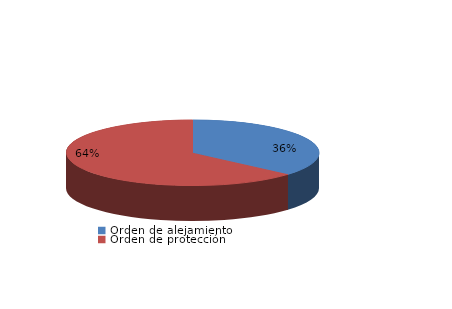
| Category | Series 0 |
|---|---|
| Orden de alejamiento | 83 |
| Orden de protección | 145 |